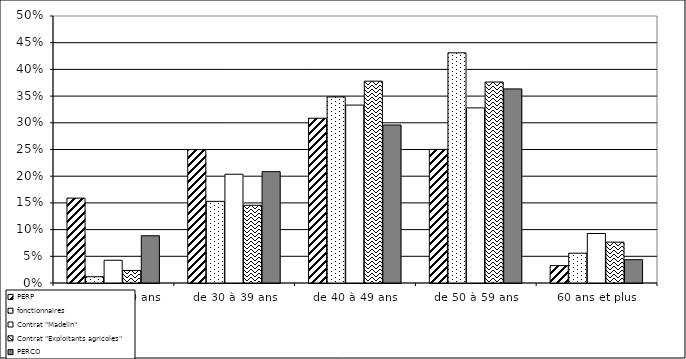
| Category | PERP | fonctionnaires | Contrat "Madelin" | Contrat "Exploitants agricoles" | PERCO |
|---|---|---|---|---|---|
| moins de 30 ans | 0.159 | 0.012 | 0.043 | 0.023 | 0.088 |
| de 30 à 39 ans | 0.25 | 0.153 | 0.204 | 0.146 | 0.208 |
| de 40 à 49 ans | 0.309 | 0.348 | 0.333 | 0.378 | 0.296 |
| de 50 à 59 ans | 0.25 | 0.431 | 0.328 | 0.376 | 0.364 |
| 60 ans et plus | 0.033 | 0.056 | 0.093 | 0.077 | 0.044 |